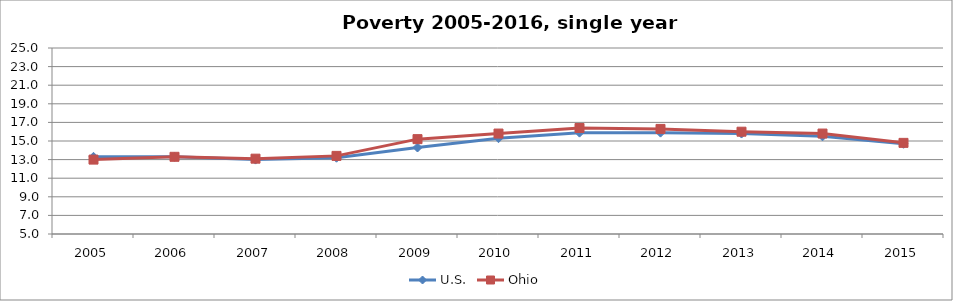
| Category | U.S. | Ohio |
|---|---|---|
| 2005 | 13.3 | 13 |
| 2006 | 13.3 | 13.3 |
| 2007 | 13 | 13.1 |
| 2008 | 13.2 | 13.4 |
| 2009 | 14.3 | 15.2 |
| 2010 | 15.3 | 15.8 |
| 2011 | 15.9 | 16.4 |
| 2012 | 15.9 | 16.3 |
| 2013 | 15.8 | 16 |
| 2014 | 15.5 | 15.8 |
| 2015 | 14.7 | 14.8 |